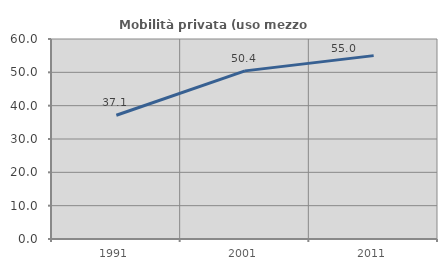
| Category | Mobilità privata (uso mezzo privato) |
|---|---|
| 1991.0 | 37.117 |
| 2001.0 | 50.44 |
| 2011.0 | 55.014 |